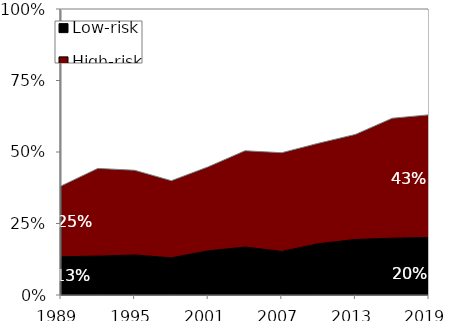
| Category | Low-risk | High-risk | No debt |
|---|---|---|---|
| 1989.0 | 0.134 | 0.247 | 0.619 |
| 1992.0 | 0.136 | 0.307 | 0.557 |
| 1995.0 | 0.14 | 0.296 | 0.564 |
| 1998.0 | 0.13 | 0.27 | 0.6 |
| 2001.0 | 0.154 | 0.294 | 0.552 |
| 2004.0 | 0.168 | 0.337 | 0.496 |
| 2007.0 | 0.153 | 0.345 | 0.503 |
| 2010.0 | 0.179 | 0.351 | 0.469 |
| 2013.0 | 0.194 | 0.367 | 0.438 |
| 2016.0 | 0.199 | 0.419 | 0.382 |
| 2019.0 | 0.201 | 0.429 | 0.37 |